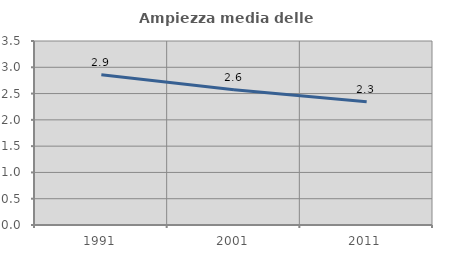
| Category | Ampiezza media delle famiglie |
|---|---|
| 1991.0 | 2.857 |
| 2001.0 | 2.572 |
| 2011.0 | 2.347 |